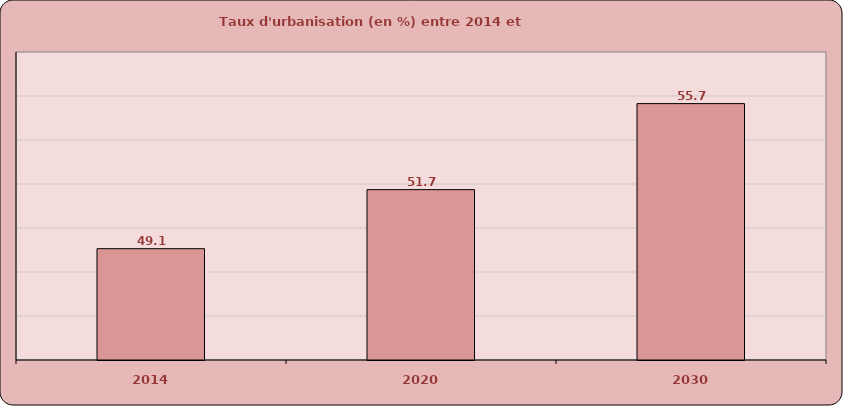
| Category | Taux d'urbanisation |
|---|---|
| 2014.0 | 49.059 |
| 2020.0 | 51.744 |
| 2030.0 | 55.653 |